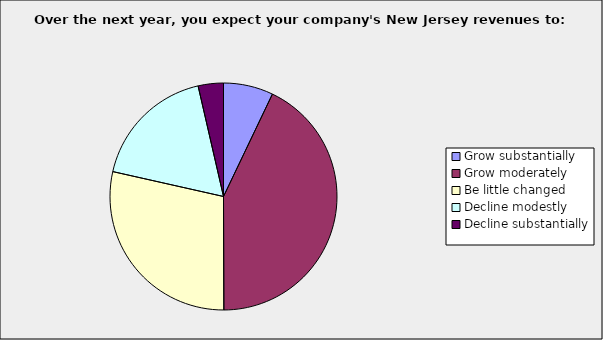
| Category | Series 0 |
|---|---|
| Grow substantially | 0.071 |
| Grow moderately | 0.429 |
| Be little changed | 0.286 |
| Decline modestly | 0.179 |
| Decline substantially | 0.036 |